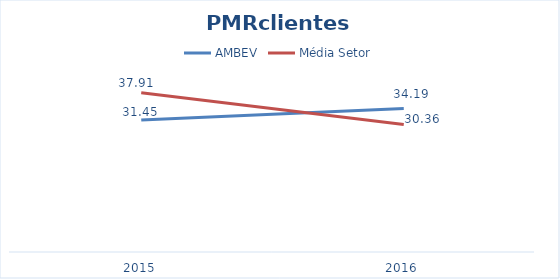
| Category | AMBEV | Média Setor |
|---|---|---|
| 2015.0 | 31.446 | 37.91 |
| 2016.0 | 34.189 | 30.364 |